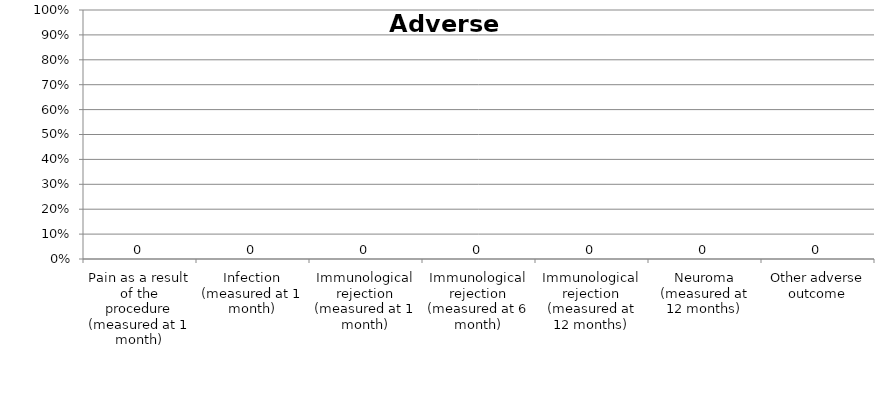
| Category | Series 0 |
|---|---|
| Pain as a result of the procedure (measured at 1 month) | 0 |
| Infection (measured at 1 month) | 0 |
| Immunological rejection (measured at 1 month) | 0 |
| Immunological rejection (measured at 6 month) | 0 |
| Immunological rejection (measured at 12 months) | 0 |
| Neuroma (measured at 12 months) | 0 |
| Other adverse outcome | 0 |